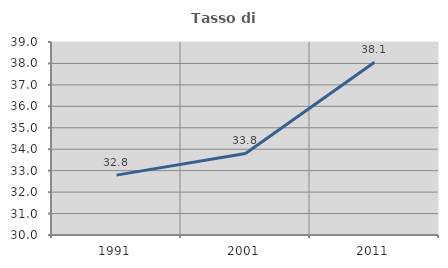
| Category | Tasso di occupazione   |
|---|---|
| 1991.0 | 32.793 |
| 2001.0 | 33.803 |
| 2011.0 | 38.052 |